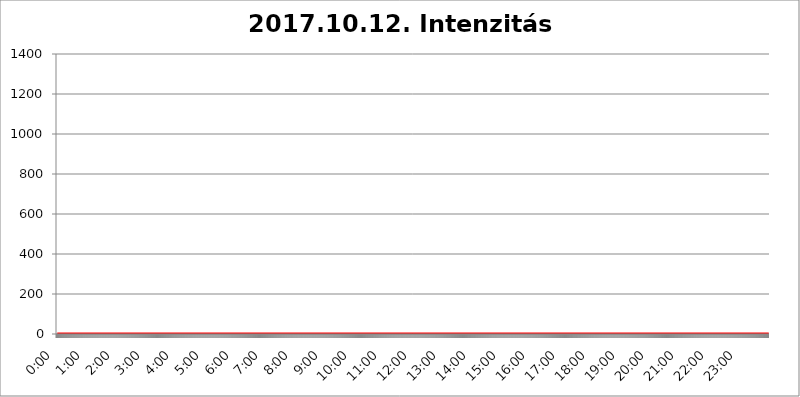
| Category | 2017.10.12. Intenzitás [W/m^2] |
|---|---|
| 0.0 | 0 |
| 0.0006944444444444445 | 0 |
| 0.001388888888888889 | 0 |
| 0.0020833333333333333 | 0 |
| 0.002777777777777778 | 0 |
| 0.003472222222222222 | 0 |
| 0.004166666666666667 | 0 |
| 0.004861111111111111 | 0 |
| 0.005555555555555556 | 0 |
| 0.0062499999999999995 | 0 |
| 0.006944444444444444 | 0 |
| 0.007638888888888889 | 0 |
| 0.008333333333333333 | 0 |
| 0.009027777777777779 | 0 |
| 0.009722222222222222 | 0 |
| 0.010416666666666666 | 0 |
| 0.011111111111111112 | 0 |
| 0.011805555555555555 | 0 |
| 0.012499999999999999 | 0 |
| 0.013194444444444444 | 0 |
| 0.013888888888888888 | 0 |
| 0.014583333333333332 | 0 |
| 0.015277777777777777 | 0 |
| 0.015972222222222224 | 0 |
| 0.016666666666666666 | 0 |
| 0.017361111111111112 | 0 |
| 0.018055555555555557 | 0 |
| 0.01875 | 0 |
| 0.019444444444444445 | 0 |
| 0.02013888888888889 | 0 |
| 0.020833333333333332 | 0 |
| 0.02152777777777778 | 0 |
| 0.022222222222222223 | 0 |
| 0.02291666666666667 | 0 |
| 0.02361111111111111 | 0 |
| 0.024305555555555556 | 0 |
| 0.024999999999999998 | 0 |
| 0.025694444444444447 | 0 |
| 0.02638888888888889 | 0 |
| 0.027083333333333334 | 0 |
| 0.027777777777777776 | 0 |
| 0.02847222222222222 | 0 |
| 0.029166666666666664 | 0 |
| 0.029861111111111113 | 0 |
| 0.030555555555555555 | 0 |
| 0.03125 | 0 |
| 0.03194444444444445 | 0 |
| 0.03263888888888889 | 0 |
| 0.03333333333333333 | 0 |
| 0.034027777777777775 | 0 |
| 0.034722222222222224 | 0 |
| 0.035416666666666666 | 0 |
| 0.036111111111111115 | 0 |
| 0.03680555555555556 | 0 |
| 0.0375 | 0 |
| 0.03819444444444444 | 0 |
| 0.03888888888888889 | 0 |
| 0.03958333333333333 | 0 |
| 0.04027777777777778 | 0 |
| 0.04097222222222222 | 0 |
| 0.041666666666666664 | 0 |
| 0.042361111111111106 | 0 |
| 0.04305555555555556 | 0 |
| 0.043750000000000004 | 0 |
| 0.044444444444444446 | 0 |
| 0.04513888888888889 | 0 |
| 0.04583333333333334 | 0 |
| 0.04652777777777778 | 0 |
| 0.04722222222222222 | 0 |
| 0.04791666666666666 | 0 |
| 0.04861111111111111 | 0 |
| 0.049305555555555554 | 0 |
| 0.049999999999999996 | 0 |
| 0.05069444444444445 | 0 |
| 0.051388888888888894 | 0 |
| 0.052083333333333336 | 0 |
| 0.05277777777777778 | 0 |
| 0.05347222222222222 | 0 |
| 0.05416666666666667 | 0 |
| 0.05486111111111111 | 0 |
| 0.05555555555555555 | 0 |
| 0.05625 | 0 |
| 0.05694444444444444 | 0 |
| 0.057638888888888885 | 0 |
| 0.05833333333333333 | 0 |
| 0.05902777777777778 | 0 |
| 0.059722222222222225 | 0 |
| 0.06041666666666667 | 0 |
| 0.061111111111111116 | 0 |
| 0.06180555555555556 | 0 |
| 0.0625 | 0 |
| 0.06319444444444444 | 0 |
| 0.06388888888888888 | 0 |
| 0.06458333333333334 | 0 |
| 0.06527777777777778 | 0 |
| 0.06597222222222222 | 0 |
| 0.06666666666666667 | 0 |
| 0.06736111111111111 | 0 |
| 0.06805555555555555 | 0 |
| 0.06874999999999999 | 0 |
| 0.06944444444444443 | 0 |
| 0.07013888888888889 | 0 |
| 0.07083333333333333 | 0 |
| 0.07152777777777779 | 0 |
| 0.07222222222222223 | 0 |
| 0.07291666666666667 | 0 |
| 0.07361111111111111 | 0 |
| 0.07430555555555556 | 0 |
| 0.075 | 0 |
| 0.07569444444444444 | 0 |
| 0.0763888888888889 | 0 |
| 0.07708333333333334 | 0 |
| 0.07777777777777778 | 0 |
| 0.07847222222222222 | 0 |
| 0.07916666666666666 | 0 |
| 0.0798611111111111 | 0 |
| 0.08055555555555556 | 0 |
| 0.08125 | 0 |
| 0.08194444444444444 | 0 |
| 0.08263888888888889 | 0 |
| 0.08333333333333333 | 0 |
| 0.08402777777777777 | 0 |
| 0.08472222222222221 | 0 |
| 0.08541666666666665 | 0 |
| 0.08611111111111112 | 0 |
| 0.08680555555555557 | 0 |
| 0.08750000000000001 | 0 |
| 0.08819444444444445 | 0 |
| 0.08888888888888889 | 0 |
| 0.08958333333333333 | 0 |
| 0.09027777777777778 | 0 |
| 0.09097222222222222 | 0 |
| 0.09166666666666667 | 0 |
| 0.09236111111111112 | 0 |
| 0.09305555555555556 | 0 |
| 0.09375 | 0 |
| 0.09444444444444444 | 0 |
| 0.09513888888888888 | 0 |
| 0.09583333333333333 | 0 |
| 0.09652777777777777 | 0 |
| 0.09722222222222222 | 0 |
| 0.09791666666666667 | 0 |
| 0.09861111111111111 | 0 |
| 0.09930555555555555 | 0 |
| 0.09999999999999999 | 0 |
| 0.10069444444444443 | 0 |
| 0.1013888888888889 | 0 |
| 0.10208333333333335 | 0 |
| 0.10277777777777779 | 0 |
| 0.10347222222222223 | 0 |
| 0.10416666666666667 | 0 |
| 0.10486111111111111 | 0 |
| 0.10555555555555556 | 0 |
| 0.10625 | 0 |
| 0.10694444444444444 | 0 |
| 0.1076388888888889 | 0 |
| 0.10833333333333334 | 0 |
| 0.10902777777777778 | 0 |
| 0.10972222222222222 | 0 |
| 0.1111111111111111 | 0 |
| 0.11180555555555556 | 0 |
| 0.11180555555555556 | 0 |
| 0.1125 | 0 |
| 0.11319444444444444 | 0 |
| 0.11388888888888889 | 0 |
| 0.11458333333333333 | 0 |
| 0.11527777777777777 | 0 |
| 0.11597222222222221 | 0 |
| 0.11666666666666665 | 0 |
| 0.1173611111111111 | 0 |
| 0.11805555555555557 | 0 |
| 0.11944444444444445 | 0 |
| 0.12013888888888889 | 0 |
| 0.12083333333333333 | 0 |
| 0.12152777777777778 | 0 |
| 0.12222222222222223 | 0 |
| 0.12291666666666667 | 0 |
| 0.12291666666666667 | 0 |
| 0.12361111111111112 | 0 |
| 0.12430555555555556 | 0 |
| 0.125 | 0 |
| 0.12569444444444444 | 0 |
| 0.12638888888888888 | 0 |
| 0.12708333333333333 | 0 |
| 0.16875 | 0 |
| 0.12847222222222224 | 0 |
| 0.12916666666666668 | 0 |
| 0.12986111111111112 | 0 |
| 0.13055555555555556 | 0 |
| 0.13125 | 0 |
| 0.13194444444444445 | 0 |
| 0.1326388888888889 | 0 |
| 0.13333333333333333 | 0 |
| 0.13402777777777777 | 0 |
| 0.13402777777777777 | 0 |
| 0.13472222222222222 | 0 |
| 0.13541666666666666 | 0 |
| 0.1361111111111111 | 0 |
| 0.13749999999999998 | 0 |
| 0.13819444444444443 | 0 |
| 0.1388888888888889 | 0 |
| 0.13958333333333334 | 0 |
| 0.14027777777777778 | 0 |
| 0.14097222222222222 | 0 |
| 0.14166666666666666 | 0 |
| 0.1423611111111111 | 0 |
| 0.14305555555555557 | 0 |
| 0.14375000000000002 | 0 |
| 0.14444444444444446 | 0 |
| 0.1451388888888889 | 0 |
| 0.1451388888888889 | 0 |
| 0.14652777777777778 | 0 |
| 0.14722222222222223 | 0 |
| 0.14791666666666667 | 0 |
| 0.1486111111111111 | 0 |
| 0.14930555555555555 | 0 |
| 0.15 | 0 |
| 0.15069444444444444 | 0 |
| 0.15138888888888888 | 0 |
| 0.15208333333333332 | 0 |
| 0.15277777777777776 | 0 |
| 0.15347222222222223 | 0 |
| 0.15416666666666667 | 0 |
| 0.15486111111111112 | 0 |
| 0.15555555555555556 | 0 |
| 0.15625 | 0 |
| 0.15694444444444444 | 0 |
| 0.15763888888888888 | 0 |
| 0.15833333333333333 | 0 |
| 0.15902777777777777 | 0 |
| 0.15972222222222224 | 0 |
| 0.16041666666666668 | 0 |
| 0.16111111111111112 | 0 |
| 0.16180555555555556 | 0 |
| 0.1625 | 0 |
| 0.16319444444444445 | 0 |
| 0.1638888888888889 | 0 |
| 0.16458333333333333 | 0 |
| 0.16527777777777777 | 0 |
| 0.16597222222222222 | 0 |
| 0.16666666666666666 | 0 |
| 0.1673611111111111 | 0 |
| 0.16805555555555554 | 0 |
| 0.16874999999999998 | 0 |
| 0.16944444444444443 | 0 |
| 0.17013888888888887 | 0 |
| 0.1708333333333333 | 0 |
| 0.17152777777777775 | 0 |
| 0.17222222222222225 | 0 |
| 0.1729166666666667 | 0 |
| 0.17361111111111113 | 0 |
| 0.17430555555555557 | 0 |
| 0.17500000000000002 | 0 |
| 0.17569444444444446 | 0 |
| 0.1763888888888889 | 0 |
| 0.17708333333333334 | 0 |
| 0.17777777777777778 | 0 |
| 0.17847222222222223 | 0 |
| 0.17916666666666667 | 0 |
| 0.1798611111111111 | 0 |
| 0.18055555555555555 | 0 |
| 0.18125 | 0 |
| 0.18194444444444444 | 0 |
| 0.1826388888888889 | 0 |
| 0.18333333333333335 | 0 |
| 0.1840277777777778 | 0 |
| 0.18472222222222223 | 0 |
| 0.18541666666666667 | 0 |
| 0.18611111111111112 | 0 |
| 0.18680555555555556 | 0 |
| 0.1875 | 0 |
| 0.18819444444444444 | 0 |
| 0.18888888888888888 | 0 |
| 0.18958333333333333 | 0 |
| 0.19027777777777777 | 0 |
| 0.1909722222222222 | 0 |
| 0.19166666666666665 | 0 |
| 0.19236111111111112 | 0 |
| 0.19305555555555554 | 0 |
| 0.19375 | 0 |
| 0.19444444444444445 | 0 |
| 0.1951388888888889 | 0 |
| 0.19583333333333333 | 0 |
| 0.19652777777777777 | 0 |
| 0.19722222222222222 | 0 |
| 0.19791666666666666 | 0 |
| 0.1986111111111111 | 0 |
| 0.19930555555555554 | 0 |
| 0.19999999999999998 | 0 |
| 0.20069444444444443 | 0 |
| 0.20138888888888887 | 0 |
| 0.2020833333333333 | 0 |
| 0.2027777777777778 | 0 |
| 0.2034722222222222 | 0 |
| 0.2041666666666667 | 0 |
| 0.20486111111111113 | 0 |
| 0.20555555555555557 | 0 |
| 0.20625000000000002 | 0 |
| 0.20694444444444446 | 0 |
| 0.2076388888888889 | 0 |
| 0.20833333333333334 | 0 |
| 0.20902777777777778 | 0 |
| 0.20972222222222223 | 0 |
| 0.21041666666666667 | 0 |
| 0.2111111111111111 | 0 |
| 0.21180555555555555 | 0 |
| 0.2125 | 0 |
| 0.21319444444444444 | 0 |
| 0.2138888888888889 | 0 |
| 0.21458333333333335 | 0 |
| 0.2152777777777778 | 0 |
| 0.21597222222222223 | 0 |
| 0.21666666666666667 | 0 |
| 0.21736111111111112 | 0 |
| 0.21805555555555556 | 0 |
| 0.21875 | 0 |
| 0.21944444444444444 | 0 |
| 0.22013888888888888 | 0 |
| 0.22083333333333333 | 0 |
| 0.22152777777777777 | 0 |
| 0.2222222222222222 | 0 |
| 0.22291666666666665 | 0 |
| 0.2236111111111111 | 0 |
| 0.22430555555555556 | 0 |
| 0.225 | 0 |
| 0.22569444444444445 | 0 |
| 0.2263888888888889 | 0 |
| 0.22708333333333333 | 0 |
| 0.22777777777777777 | 0 |
| 0.22847222222222222 | 0 |
| 0.22916666666666666 | 0 |
| 0.2298611111111111 | 0 |
| 0.23055555555555554 | 0 |
| 0.23124999999999998 | 0 |
| 0.23194444444444443 | 0 |
| 0.23263888888888887 | 0 |
| 0.2333333333333333 | 0 |
| 0.2340277777777778 | 0 |
| 0.2347222222222222 | 0 |
| 0.2354166666666667 | 0 |
| 0.23611111111111113 | 0 |
| 0.23680555555555557 | 0 |
| 0.23750000000000002 | 0 |
| 0.23819444444444446 | 0 |
| 0.2388888888888889 | 0 |
| 0.23958333333333334 | 0 |
| 0.24027777777777778 | 0 |
| 0.24097222222222223 | 0 |
| 0.24166666666666667 | 0 |
| 0.2423611111111111 | 0 |
| 0.24305555555555555 | 0 |
| 0.24375 | 0 |
| 0.24444444444444446 | 0 |
| 0.24513888888888888 | 0 |
| 0.24583333333333335 | 0 |
| 0.2465277777777778 | 0 |
| 0.24722222222222223 | 0 |
| 0.24791666666666667 | 0 |
| 0.24861111111111112 | 0 |
| 0.24930555555555556 | 0 |
| 0.25 | 0 |
| 0.25069444444444444 | 0 |
| 0.2513888888888889 | 0 |
| 0.2520833333333333 | 0 |
| 0.25277777777777777 | 0 |
| 0.2534722222222222 | 0 |
| 0.25416666666666665 | 0 |
| 0.2548611111111111 | 0 |
| 0.2555555555555556 | 0 |
| 0.25625000000000003 | 0 |
| 0.2569444444444445 | 0 |
| 0.2576388888888889 | 0 |
| 0.25833333333333336 | 0 |
| 0.2590277777777778 | 0 |
| 0.25972222222222224 | 0 |
| 0.2604166666666667 | 0 |
| 0.2611111111111111 | 0 |
| 0.26180555555555557 | 0 |
| 0.2625 | 0 |
| 0.26319444444444445 | 0 |
| 0.2638888888888889 | 0 |
| 0.26458333333333334 | 0 |
| 0.2652777777777778 | 0 |
| 0.2659722222222222 | 0 |
| 0.26666666666666666 | 0 |
| 0.2673611111111111 | 0 |
| 0.26805555555555555 | 0 |
| 0.26875 | 0 |
| 0.26944444444444443 | 0 |
| 0.2701388888888889 | 0 |
| 0.2708333333333333 | 0 |
| 0.27152777777777776 | 0 |
| 0.2722222222222222 | 0 |
| 0.27291666666666664 | 0 |
| 0.2736111111111111 | 0 |
| 0.2743055555555555 | 0 |
| 0.27499999999999997 | 0 |
| 0.27569444444444446 | 0 |
| 0.27638888888888885 | 0 |
| 0.27708333333333335 | 0 |
| 0.2777777777777778 | 0 |
| 0.27847222222222223 | 0 |
| 0.2791666666666667 | 0 |
| 0.2798611111111111 | 0 |
| 0.28055555555555556 | 0 |
| 0.28125 | 0 |
| 0.28194444444444444 | 0 |
| 0.2826388888888889 | 0 |
| 0.2833333333333333 | 0 |
| 0.28402777777777777 | 0 |
| 0.2847222222222222 | 0 |
| 0.28541666666666665 | 0 |
| 0.28611111111111115 | 0 |
| 0.28680555555555554 | 0 |
| 0.28750000000000003 | 0 |
| 0.2881944444444445 | 0 |
| 0.2888888888888889 | 0 |
| 0.28958333333333336 | 0 |
| 0.2902777777777778 | 0 |
| 0.29097222222222224 | 0 |
| 0.2916666666666667 | 0 |
| 0.2923611111111111 | 0 |
| 0.29305555555555557 | 0 |
| 0.29375 | 0 |
| 0.29444444444444445 | 0 |
| 0.2951388888888889 | 0 |
| 0.29583333333333334 | 0 |
| 0.2965277777777778 | 0 |
| 0.2972222222222222 | 0 |
| 0.29791666666666666 | 0 |
| 0.2986111111111111 | 0 |
| 0.29930555555555555 | 0 |
| 0.3 | 0 |
| 0.30069444444444443 | 0 |
| 0.3013888888888889 | 0 |
| 0.3020833333333333 | 0 |
| 0.30277777777777776 | 0 |
| 0.3034722222222222 | 0 |
| 0.30416666666666664 | 0 |
| 0.3048611111111111 | 0 |
| 0.3055555555555555 | 0 |
| 0.30624999999999997 | 0 |
| 0.3069444444444444 | 0 |
| 0.3076388888888889 | 0 |
| 0.30833333333333335 | 0 |
| 0.3090277777777778 | 0 |
| 0.30972222222222223 | 0 |
| 0.3104166666666667 | 0 |
| 0.3111111111111111 | 0 |
| 0.31180555555555556 | 0 |
| 0.3125 | 0 |
| 0.31319444444444444 | 0 |
| 0.3138888888888889 | 0 |
| 0.3145833333333333 | 0 |
| 0.31527777777777777 | 0 |
| 0.3159722222222222 | 0 |
| 0.31666666666666665 | 0 |
| 0.31736111111111115 | 0 |
| 0.31805555555555554 | 0 |
| 0.31875000000000003 | 0 |
| 0.3194444444444445 | 0 |
| 0.3201388888888889 | 0 |
| 0.32083333333333336 | 0 |
| 0.3215277777777778 | 0 |
| 0.32222222222222224 | 0 |
| 0.3229166666666667 | 0 |
| 0.3236111111111111 | 0 |
| 0.32430555555555557 | 0 |
| 0.325 | 0 |
| 0.32569444444444445 | 0 |
| 0.3263888888888889 | 0 |
| 0.32708333333333334 | 0 |
| 0.3277777777777778 | 0 |
| 0.3284722222222222 | 0 |
| 0.32916666666666666 | 0 |
| 0.3298611111111111 | 0 |
| 0.33055555555555555 | 0 |
| 0.33125 | 0 |
| 0.33194444444444443 | 0 |
| 0.3326388888888889 | 0 |
| 0.3333333333333333 | 0 |
| 0.3340277777777778 | 0 |
| 0.3347222222222222 | 0 |
| 0.3354166666666667 | 0 |
| 0.3361111111111111 | 0 |
| 0.3368055555555556 | 0 |
| 0.33749999999999997 | 0 |
| 0.33819444444444446 | 0 |
| 0.33888888888888885 | 0 |
| 0.33958333333333335 | 0 |
| 0.34027777777777773 | 0 |
| 0.34097222222222223 | 0 |
| 0.3416666666666666 | 0 |
| 0.3423611111111111 | 0 |
| 0.3430555555555555 | 0 |
| 0.34375 | 0 |
| 0.3444444444444445 | 0 |
| 0.3451388888888889 | 0 |
| 0.3458333333333334 | 0 |
| 0.34652777777777777 | 0 |
| 0.34722222222222227 | 0 |
| 0.34791666666666665 | 0 |
| 0.34861111111111115 | 0 |
| 0.34930555555555554 | 0 |
| 0.35000000000000003 | 0 |
| 0.3506944444444444 | 0 |
| 0.3513888888888889 | 0 |
| 0.3520833333333333 | 0 |
| 0.3527777777777778 | 0 |
| 0.3534722222222222 | 0 |
| 0.3541666666666667 | 0 |
| 0.3548611111111111 | 0 |
| 0.35555555555555557 | 0 |
| 0.35625 | 0 |
| 0.35694444444444445 | 0 |
| 0.3576388888888889 | 0 |
| 0.35833333333333334 | 0 |
| 0.3590277777777778 | 0 |
| 0.3597222222222222 | 0 |
| 0.36041666666666666 | 0 |
| 0.3611111111111111 | 0 |
| 0.36180555555555555 | 0 |
| 0.3625 | 0 |
| 0.36319444444444443 | 0 |
| 0.3638888888888889 | 0 |
| 0.3645833333333333 | 0 |
| 0.3652777777777778 | 0 |
| 0.3659722222222222 | 0 |
| 0.3666666666666667 | 0 |
| 0.3673611111111111 | 0 |
| 0.3680555555555556 | 0 |
| 0.36874999999999997 | 0 |
| 0.36944444444444446 | 0 |
| 0.37013888888888885 | 0 |
| 0.37083333333333335 | 0 |
| 0.37152777777777773 | 0 |
| 0.37222222222222223 | 0 |
| 0.3729166666666666 | 0 |
| 0.3736111111111111 | 0 |
| 0.3743055555555555 | 0 |
| 0.375 | 0 |
| 0.3756944444444445 | 0 |
| 0.3763888888888889 | 0 |
| 0.3770833333333334 | 0 |
| 0.37777777777777777 | 0 |
| 0.37847222222222227 | 0 |
| 0.37916666666666665 | 0 |
| 0.37986111111111115 | 0 |
| 0.38055555555555554 | 0 |
| 0.38125000000000003 | 0 |
| 0.3819444444444444 | 0 |
| 0.3826388888888889 | 0 |
| 0.3833333333333333 | 0 |
| 0.3840277777777778 | 0 |
| 0.3847222222222222 | 0 |
| 0.3854166666666667 | 0 |
| 0.3861111111111111 | 0 |
| 0.38680555555555557 | 0 |
| 0.3875 | 0 |
| 0.38819444444444445 | 0 |
| 0.3888888888888889 | 0 |
| 0.38958333333333334 | 0 |
| 0.3902777777777778 | 0 |
| 0.3909722222222222 | 0 |
| 0.39166666666666666 | 0 |
| 0.3923611111111111 | 0 |
| 0.39305555555555555 | 0 |
| 0.39375 | 0 |
| 0.39444444444444443 | 0 |
| 0.3951388888888889 | 0 |
| 0.3958333333333333 | 0 |
| 0.3965277777777778 | 0 |
| 0.3972222222222222 | 0 |
| 0.3979166666666667 | 0 |
| 0.3986111111111111 | 0 |
| 0.3993055555555556 | 0 |
| 0.39999999999999997 | 0 |
| 0.40069444444444446 | 0 |
| 0.40138888888888885 | 0 |
| 0.40208333333333335 | 0 |
| 0.40277777777777773 | 0 |
| 0.40347222222222223 | 0 |
| 0.4041666666666666 | 0 |
| 0.4048611111111111 | 0 |
| 0.4055555555555555 | 0 |
| 0.40625 | 0 |
| 0.4069444444444445 | 0 |
| 0.4076388888888889 | 0 |
| 0.4083333333333334 | 0 |
| 0.40902777777777777 | 0 |
| 0.40972222222222227 | 0 |
| 0.41041666666666665 | 0 |
| 0.41111111111111115 | 0 |
| 0.41180555555555554 | 0 |
| 0.41250000000000003 | 0 |
| 0.4131944444444444 | 0 |
| 0.4138888888888889 | 0 |
| 0.4145833333333333 | 0 |
| 0.4152777777777778 | 0 |
| 0.4159722222222222 | 0 |
| 0.4166666666666667 | 0 |
| 0.4173611111111111 | 0 |
| 0.41805555555555557 | 0 |
| 0.41875 | 0 |
| 0.41944444444444445 | 0 |
| 0.4201388888888889 | 0 |
| 0.42083333333333334 | 0 |
| 0.4215277777777778 | 0 |
| 0.4222222222222222 | 0 |
| 0.42291666666666666 | 0 |
| 0.4236111111111111 | 0 |
| 0.42430555555555555 | 0 |
| 0.425 | 0 |
| 0.42569444444444443 | 0 |
| 0.4263888888888889 | 0 |
| 0.4270833333333333 | 0 |
| 0.4277777777777778 | 0 |
| 0.4284722222222222 | 0 |
| 0.4291666666666667 | 0 |
| 0.4298611111111111 | 0 |
| 0.4305555555555556 | 0 |
| 0.43124999999999997 | 0 |
| 0.43194444444444446 | 0 |
| 0.43263888888888885 | 0 |
| 0.43333333333333335 | 0 |
| 0.43402777777777773 | 0 |
| 0.43472222222222223 | 0 |
| 0.4354166666666666 | 0 |
| 0.4361111111111111 | 0 |
| 0.4368055555555555 | 0 |
| 0.4375 | 0 |
| 0.4381944444444445 | 0 |
| 0.4388888888888889 | 0 |
| 0.4395833333333334 | 0 |
| 0.44027777777777777 | 0 |
| 0.44097222222222227 | 0 |
| 0.44166666666666665 | 0 |
| 0.44236111111111115 | 0 |
| 0.44305555555555554 | 0 |
| 0.44375000000000003 | 0 |
| 0.4444444444444444 | 0 |
| 0.4451388888888889 | 0 |
| 0.4458333333333333 | 0 |
| 0.4465277777777778 | 0 |
| 0.4472222222222222 | 0 |
| 0.4479166666666667 | 0 |
| 0.4486111111111111 | 0 |
| 0.44930555555555557 | 0 |
| 0.45 | 0 |
| 0.45069444444444445 | 0 |
| 0.4513888888888889 | 0 |
| 0.45208333333333334 | 0 |
| 0.4527777777777778 | 0 |
| 0.4534722222222222 | 0 |
| 0.45416666666666666 | 0 |
| 0.4548611111111111 | 0 |
| 0.45555555555555555 | 0 |
| 0.45625 | 0 |
| 0.45694444444444443 | 0 |
| 0.4576388888888889 | 0 |
| 0.4583333333333333 | 0 |
| 0.4590277777777778 | 0 |
| 0.4597222222222222 | 0 |
| 0.4604166666666667 | 0 |
| 0.4611111111111111 | 0 |
| 0.4618055555555556 | 0 |
| 0.46249999999999997 | 0 |
| 0.46319444444444446 | 0 |
| 0.46388888888888885 | 0 |
| 0.46458333333333335 | 0 |
| 0.46527777777777773 | 0 |
| 0.46597222222222223 | 0 |
| 0.4666666666666666 | 0 |
| 0.4673611111111111 | 0 |
| 0.4680555555555555 | 0 |
| 0.46875 | 0 |
| 0.4694444444444445 | 0 |
| 0.4701388888888889 | 0 |
| 0.4708333333333334 | 0 |
| 0.47152777777777777 | 0 |
| 0.47222222222222227 | 0 |
| 0.47291666666666665 | 0 |
| 0.47361111111111115 | 0 |
| 0.47430555555555554 | 0 |
| 0.47500000000000003 | 0 |
| 0.4756944444444444 | 0 |
| 0.4763888888888889 | 0 |
| 0.4770833333333333 | 0 |
| 0.4777777777777778 | 0 |
| 0.4784722222222222 | 0 |
| 0.4791666666666667 | 0 |
| 0.4798611111111111 | 0 |
| 0.48055555555555557 | 0 |
| 0.48125 | 0 |
| 0.48194444444444445 | 0 |
| 0.4826388888888889 | 0 |
| 0.48333333333333334 | 0 |
| 0.4840277777777778 | 0 |
| 0.4847222222222222 | 0 |
| 0.48541666666666666 | 0 |
| 0.4861111111111111 | 0 |
| 0.48680555555555555 | 0 |
| 0.4875 | 0 |
| 0.48819444444444443 | 0 |
| 0.4888888888888889 | 0 |
| 0.4895833333333333 | 0 |
| 0.4902777777777778 | 0 |
| 0.4909722222222222 | 0 |
| 0.4916666666666667 | 0 |
| 0.4923611111111111 | 0 |
| 0.4930555555555556 | 0 |
| 0.49374999999999997 | 0 |
| 0.49444444444444446 | 0 |
| 0.49513888888888885 | 0 |
| 0.49583333333333335 | 0 |
| 0.49652777777777773 | 0 |
| 0.49722222222222223 | 0 |
| 0.4979166666666666 | 0 |
| 0.4986111111111111 | 0 |
| 0.4993055555555555 | 0 |
| 0.5 | 0 |
| 0.5006944444444444 | 0 |
| 0.5013888888888889 | 0 |
| 0.5020833333333333 | 0 |
| 0.5027777777777778 | 0 |
| 0.5034722222222222 | 0 |
| 0.5041666666666667 | 0 |
| 0.5048611111111111 | 0 |
| 0.5055555555555555 | 0 |
| 0.50625 | 0 |
| 0.5069444444444444 | 0 |
| 0.5076388888888889 | 0 |
| 0.5083333333333333 | 0 |
| 0.5090277777777777 | 0 |
| 0.5097222222222222 | 0 |
| 0.5104166666666666 | 0 |
| 0.5111111111111112 | 0 |
| 0.5118055555555555 | 0 |
| 0.5125000000000001 | 0 |
| 0.5131944444444444 | 0 |
| 0.513888888888889 | 0 |
| 0.5145833333333333 | 0 |
| 0.5152777777777778 | 0 |
| 0.5159722222222222 | 0 |
| 0.5166666666666667 | 0 |
| 0.517361111111111 | 0 |
| 0.5180555555555556 | 0 |
| 0.5187499999999999 | 0 |
| 0.5194444444444445 | 0 |
| 0.5201388888888888 | 0 |
| 0.5208333333333334 | 0 |
| 0.5215277777777778 | 0 |
| 0.5222222222222223 | 0 |
| 0.5229166666666667 | 0 |
| 0.5236111111111111 | 0 |
| 0.5243055555555556 | 0 |
| 0.525 | 0 |
| 0.5256944444444445 | 0 |
| 0.5263888888888889 | 0 |
| 0.5270833333333333 | 0 |
| 0.5277777777777778 | 0 |
| 0.5284722222222222 | 0 |
| 0.5291666666666667 | 0 |
| 0.5298611111111111 | 0 |
| 0.5305555555555556 | 0 |
| 0.53125 | 0 |
| 0.5319444444444444 | 0 |
| 0.5326388888888889 | 0 |
| 0.5333333333333333 | 0 |
| 0.5340277777777778 | 0 |
| 0.5347222222222222 | 0 |
| 0.5354166666666667 | 0 |
| 0.5361111111111111 | 0 |
| 0.5368055555555555 | 0 |
| 0.5375 | 0 |
| 0.5381944444444444 | 0 |
| 0.5388888888888889 | 0 |
| 0.5395833333333333 | 0 |
| 0.5402777777777777 | 0 |
| 0.5409722222222222 | 0 |
| 0.5416666666666666 | 0 |
| 0.5423611111111112 | 0 |
| 0.5430555555555555 | 0 |
| 0.5437500000000001 | 0 |
| 0.5444444444444444 | 0 |
| 0.545138888888889 | 0 |
| 0.5458333333333333 | 0 |
| 0.5465277777777778 | 0 |
| 0.5472222222222222 | 0 |
| 0.5479166666666667 | 0 |
| 0.548611111111111 | 0 |
| 0.5493055555555556 | 0 |
| 0.5499999999999999 | 0 |
| 0.5506944444444445 | 0 |
| 0.5513888888888888 | 0 |
| 0.5520833333333334 | 0 |
| 0.5527777777777778 | 0 |
| 0.5534722222222223 | 0 |
| 0.5541666666666667 | 0 |
| 0.5548611111111111 | 0 |
| 0.5555555555555556 | 0 |
| 0.55625 | 0 |
| 0.5569444444444445 | 0 |
| 0.5576388888888889 | 0 |
| 0.5583333333333333 | 0 |
| 0.5590277777777778 | 0 |
| 0.5597222222222222 | 0 |
| 0.5604166666666667 | 0 |
| 0.5611111111111111 | 0 |
| 0.5618055555555556 | 0 |
| 0.5625 | 0 |
| 0.5631944444444444 | 0 |
| 0.5638888888888889 | 0 |
| 0.5645833333333333 | 0 |
| 0.5652777777777778 | 0 |
| 0.5659722222222222 | 0 |
| 0.5666666666666667 | 0 |
| 0.5673611111111111 | 0 |
| 0.5680555555555555 | 0 |
| 0.56875 | 0 |
| 0.5694444444444444 | 0 |
| 0.5701388888888889 | 0 |
| 0.5708333333333333 | 0 |
| 0.5715277777777777 | 0 |
| 0.5722222222222222 | 0 |
| 0.5729166666666666 | 0 |
| 0.5736111111111112 | 0 |
| 0.5743055555555555 | 0 |
| 0.5750000000000001 | 0 |
| 0.5756944444444444 | 0 |
| 0.576388888888889 | 0 |
| 0.5770833333333333 | 0 |
| 0.5777777777777778 | 0 |
| 0.5784722222222222 | 0 |
| 0.5791666666666667 | 0 |
| 0.579861111111111 | 0 |
| 0.5805555555555556 | 0 |
| 0.5812499999999999 | 0 |
| 0.5819444444444445 | 0 |
| 0.5826388888888888 | 0 |
| 0.5833333333333334 | 0 |
| 0.5840277777777778 | 0 |
| 0.5847222222222223 | 0 |
| 0.5854166666666667 | 0 |
| 0.5861111111111111 | 0 |
| 0.5868055555555556 | 0 |
| 0.5875 | 0 |
| 0.5881944444444445 | 0 |
| 0.5888888888888889 | 0 |
| 0.5895833333333333 | 0 |
| 0.5902777777777778 | 0 |
| 0.5909722222222222 | 0 |
| 0.5916666666666667 | 0 |
| 0.5923611111111111 | 0 |
| 0.5930555555555556 | 0 |
| 0.59375 | 0 |
| 0.5944444444444444 | 0 |
| 0.5951388888888889 | 0 |
| 0.5958333333333333 | 0 |
| 0.5965277777777778 | 0 |
| 0.5972222222222222 | 0 |
| 0.5979166666666667 | 0 |
| 0.5986111111111111 | 0 |
| 0.5993055555555555 | 0 |
| 0.6 | 0 |
| 0.6006944444444444 | 0 |
| 0.6013888888888889 | 0 |
| 0.6020833333333333 | 0 |
| 0.6027777777777777 | 0 |
| 0.6034722222222222 | 0 |
| 0.6041666666666666 | 0 |
| 0.6048611111111112 | 0 |
| 0.6055555555555555 | 0 |
| 0.6062500000000001 | 0 |
| 0.6069444444444444 | 0 |
| 0.607638888888889 | 0 |
| 0.6083333333333333 | 0 |
| 0.6090277777777778 | 0 |
| 0.6097222222222222 | 0 |
| 0.6104166666666667 | 0 |
| 0.611111111111111 | 0 |
| 0.6118055555555556 | 0 |
| 0.6124999999999999 | 0 |
| 0.6131944444444445 | 0 |
| 0.6138888888888888 | 0 |
| 0.6145833333333334 | 0 |
| 0.6152777777777778 | 0 |
| 0.6159722222222223 | 0 |
| 0.6166666666666667 | 0 |
| 0.6173611111111111 | 0 |
| 0.6180555555555556 | 0 |
| 0.61875 | 0 |
| 0.6194444444444445 | 0 |
| 0.6201388888888889 | 0 |
| 0.6208333333333333 | 0 |
| 0.6215277777777778 | 0 |
| 0.6222222222222222 | 0 |
| 0.6229166666666667 | 0 |
| 0.6236111111111111 | 0 |
| 0.6243055555555556 | 0 |
| 0.625 | 0 |
| 0.6256944444444444 | 0 |
| 0.6263888888888889 | 0 |
| 0.6270833333333333 | 0 |
| 0.6277777777777778 | 0 |
| 0.6284722222222222 | 0 |
| 0.6291666666666667 | 0 |
| 0.6298611111111111 | 0 |
| 0.6305555555555555 | 0 |
| 0.63125 | 0 |
| 0.6319444444444444 | 0 |
| 0.6326388888888889 | 0 |
| 0.6333333333333333 | 0 |
| 0.6340277777777777 | 0 |
| 0.6347222222222222 | 0 |
| 0.6354166666666666 | 0 |
| 0.6361111111111112 | 0 |
| 0.6368055555555555 | 0 |
| 0.6375000000000001 | 0 |
| 0.6381944444444444 | 0 |
| 0.638888888888889 | 0 |
| 0.6395833333333333 | 0 |
| 0.6402777777777778 | 0 |
| 0.6409722222222222 | 0 |
| 0.6416666666666667 | 0 |
| 0.642361111111111 | 0 |
| 0.6430555555555556 | 0 |
| 0.6437499999999999 | 0 |
| 0.6444444444444445 | 0 |
| 0.6451388888888888 | 0 |
| 0.6458333333333334 | 0 |
| 0.6465277777777778 | 0 |
| 0.6472222222222223 | 0 |
| 0.6479166666666667 | 0 |
| 0.6486111111111111 | 0 |
| 0.6493055555555556 | 0 |
| 0.65 | 0 |
| 0.6506944444444445 | 0 |
| 0.6513888888888889 | 0 |
| 0.6520833333333333 | 0 |
| 0.6527777777777778 | 0 |
| 0.6534722222222222 | 0 |
| 0.6541666666666667 | 0 |
| 0.6548611111111111 | 0 |
| 0.6555555555555556 | 0 |
| 0.65625 | 0 |
| 0.6569444444444444 | 0 |
| 0.6576388888888889 | 0 |
| 0.6583333333333333 | 0 |
| 0.6590277777777778 | 0 |
| 0.6597222222222222 | 0 |
| 0.6604166666666667 | 0 |
| 0.6611111111111111 | 0 |
| 0.6618055555555555 | 0 |
| 0.6625 | 0 |
| 0.6631944444444444 | 0 |
| 0.6638888888888889 | 0 |
| 0.6645833333333333 | 0 |
| 0.6652777777777777 | 0 |
| 0.6659722222222222 | 0 |
| 0.6666666666666666 | 0 |
| 0.6673611111111111 | 0 |
| 0.6680555555555556 | 0 |
| 0.6687500000000001 | 0 |
| 0.6694444444444444 | 0 |
| 0.6701388888888888 | 0 |
| 0.6708333333333334 | 0 |
| 0.6715277777777778 | 0 |
| 0.6722222222222222 | 0 |
| 0.6729166666666666 | 0 |
| 0.6736111111111112 | 0 |
| 0.6743055555555556 | 0 |
| 0.6749999999999999 | 0 |
| 0.6756944444444444 | 0 |
| 0.6763888888888889 | 0 |
| 0.6770833333333334 | 0 |
| 0.6777777777777777 | 0 |
| 0.6784722222222223 | 0 |
| 0.6791666666666667 | 0 |
| 0.6798611111111111 | 0 |
| 0.6805555555555555 | 0 |
| 0.68125 | 0 |
| 0.6819444444444445 | 0 |
| 0.6826388888888889 | 0 |
| 0.6833333333333332 | 0 |
| 0.6840277777777778 | 0 |
| 0.6847222222222222 | 0 |
| 0.6854166666666667 | 0 |
| 0.686111111111111 | 0 |
| 0.6868055555555556 | 0 |
| 0.6875 | 0 |
| 0.6881944444444444 | 0 |
| 0.688888888888889 | 0 |
| 0.6895833333333333 | 0 |
| 0.6902777777777778 | 0 |
| 0.6909722222222222 | 0 |
| 0.6916666666666668 | 0 |
| 0.6923611111111111 | 0 |
| 0.6930555555555555 | 0 |
| 0.69375 | 0 |
| 0.6944444444444445 | 0 |
| 0.6951388888888889 | 0 |
| 0.6958333333333333 | 0 |
| 0.6965277777777777 | 0 |
| 0.6972222222222223 | 0 |
| 0.6979166666666666 | 0 |
| 0.6986111111111111 | 0 |
| 0.6993055555555556 | 0 |
| 0.7000000000000001 | 0 |
| 0.7006944444444444 | 0 |
| 0.7013888888888888 | 0 |
| 0.7020833333333334 | 0 |
| 0.7027777777777778 | 0 |
| 0.7034722222222222 | 0 |
| 0.7041666666666666 | 0 |
| 0.7048611111111112 | 0 |
| 0.7055555555555556 | 0 |
| 0.7062499999999999 | 0 |
| 0.7069444444444444 | 0 |
| 0.7076388888888889 | 0 |
| 0.7083333333333334 | 0 |
| 0.7090277777777777 | 0 |
| 0.7097222222222223 | 0 |
| 0.7104166666666667 | 0 |
| 0.7111111111111111 | 0 |
| 0.7118055555555555 | 0 |
| 0.7125 | 0 |
| 0.7131944444444445 | 0 |
| 0.7138888888888889 | 0 |
| 0.7145833333333332 | 0 |
| 0.7152777777777778 | 0 |
| 0.7159722222222222 | 0 |
| 0.7166666666666667 | 0 |
| 0.717361111111111 | 0 |
| 0.7180555555555556 | 0 |
| 0.71875 | 0 |
| 0.7194444444444444 | 0 |
| 0.720138888888889 | 0 |
| 0.7208333333333333 | 0 |
| 0.7215277777777778 | 0 |
| 0.7222222222222222 | 0 |
| 0.7229166666666668 | 0 |
| 0.7236111111111111 | 0 |
| 0.7243055555555555 | 0 |
| 0.725 | 0 |
| 0.7256944444444445 | 0 |
| 0.7263888888888889 | 0 |
| 0.7270833333333333 | 0 |
| 0.7277777777777777 | 0 |
| 0.7284722222222223 | 0 |
| 0.7291666666666666 | 0 |
| 0.7298611111111111 | 0 |
| 0.7305555555555556 | 0 |
| 0.7312500000000001 | 0 |
| 0.7319444444444444 | 0 |
| 0.7326388888888888 | 0 |
| 0.7333333333333334 | 0 |
| 0.7340277777777778 | 0 |
| 0.7347222222222222 | 0 |
| 0.7354166666666666 | 0 |
| 0.7361111111111112 | 0 |
| 0.7368055555555556 | 0 |
| 0.7374999999999999 | 0 |
| 0.7381944444444444 | 0 |
| 0.7388888888888889 | 0 |
| 0.7395833333333334 | 0 |
| 0.7402777777777777 | 0 |
| 0.7409722222222223 | 0 |
| 0.7416666666666667 | 0 |
| 0.7423611111111111 | 0 |
| 0.7430555555555555 | 0 |
| 0.74375 | 0 |
| 0.7444444444444445 | 0 |
| 0.7451388888888889 | 0 |
| 0.7458333333333332 | 0 |
| 0.7465277777777778 | 0 |
| 0.7472222222222222 | 0 |
| 0.7479166666666667 | 0 |
| 0.748611111111111 | 0 |
| 0.7493055555555556 | 0 |
| 0.75 | 0 |
| 0.7506944444444444 | 0 |
| 0.751388888888889 | 0 |
| 0.7520833333333333 | 0 |
| 0.7527777777777778 | 0 |
| 0.7534722222222222 | 0 |
| 0.7541666666666668 | 0 |
| 0.7548611111111111 | 0 |
| 0.7555555555555555 | 0 |
| 0.75625 | 0 |
| 0.7569444444444445 | 0 |
| 0.7576388888888889 | 0 |
| 0.7583333333333333 | 0 |
| 0.7590277777777777 | 0 |
| 0.7597222222222223 | 0 |
| 0.7604166666666666 | 0 |
| 0.7611111111111111 | 0 |
| 0.7618055555555556 | 0 |
| 0.7625000000000001 | 0 |
| 0.7631944444444444 | 0 |
| 0.7638888888888888 | 0 |
| 0.7645833333333334 | 0 |
| 0.7652777777777778 | 0 |
| 0.7659722222222222 | 0 |
| 0.7666666666666666 | 0 |
| 0.7673611111111112 | 0 |
| 0.7680555555555556 | 0 |
| 0.7687499999999999 | 0 |
| 0.7694444444444444 | 0 |
| 0.7701388888888889 | 0 |
| 0.7708333333333334 | 0 |
| 0.7715277777777777 | 0 |
| 0.7722222222222223 | 0 |
| 0.7729166666666667 | 0 |
| 0.7736111111111111 | 0 |
| 0.7743055555555555 | 0 |
| 0.775 | 0 |
| 0.7756944444444445 | 0 |
| 0.7763888888888889 | 0 |
| 0.7770833333333332 | 0 |
| 0.7777777777777778 | 0 |
| 0.7784722222222222 | 0 |
| 0.7791666666666667 | 0 |
| 0.779861111111111 | 0 |
| 0.7805555555555556 | 0 |
| 0.78125 | 0 |
| 0.7819444444444444 | 0 |
| 0.782638888888889 | 0 |
| 0.7833333333333333 | 0 |
| 0.7840277777777778 | 0 |
| 0.7847222222222222 | 0 |
| 0.7854166666666668 | 0 |
| 0.7861111111111111 | 0 |
| 0.7868055555555555 | 0 |
| 0.7875 | 0 |
| 0.7881944444444445 | 0 |
| 0.7888888888888889 | 0 |
| 0.7895833333333333 | 0 |
| 0.7902777777777777 | 0 |
| 0.7909722222222223 | 0 |
| 0.7916666666666666 | 0 |
| 0.7923611111111111 | 0 |
| 0.7930555555555556 | 0 |
| 0.7937500000000001 | 0 |
| 0.7944444444444444 | 0 |
| 0.7951388888888888 | 0 |
| 0.7958333333333334 | 0 |
| 0.7965277777777778 | 0 |
| 0.7972222222222222 | 0 |
| 0.7979166666666666 | 0 |
| 0.7986111111111112 | 0 |
| 0.7993055555555556 | 0 |
| 0.7999999999999999 | 0 |
| 0.8006944444444444 | 0 |
| 0.8013888888888889 | 0 |
| 0.8020833333333334 | 0 |
| 0.8027777777777777 | 0 |
| 0.8034722222222223 | 0 |
| 0.8041666666666667 | 0 |
| 0.8048611111111111 | 0 |
| 0.8055555555555555 | 0 |
| 0.80625 | 0 |
| 0.8069444444444445 | 0 |
| 0.8076388888888889 | 0 |
| 0.8083333333333332 | 0 |
| 0.8090277777777778 | 0 |
| 0.8097222222222222 | 0 |
| 0.8104166666666667 | 0 |
| 0.811111111111111 | 0 |
| 0.8118055555555556 | 0 |
| 0.8125 | 0 |
| 0.8131944444444444 | 0 |
| 0.813888888888889 | 0 |
| 0.8145833333333333 | 0 |
| 0.8152777777777778 | 0 |
| 0.8159722222222222 | 0 |
| 0.8166666666666668 | 0 |
| 0.8173611111111111 | 0 |
| 0.8180555555555555 | 0 |
| 0.81875 | 0 |
| 0.8194444444444445 | 0 |
| 0.8201388888888889 | 0 |
| 0.8208333333333333 | 0 |
| 0.8215277777777777 | 0 |
| 0.8222222222222223 | 0 |
| 0.8229166666666666 | 0 |
| 0.8236111111111111 | 0 |
| 0.8243055555555556 | 0 |
| 0.8250000000000001 | 0 |
| 0.8256944444444444 | 0 |
| 0.8263888888888888 | 0 |
| 0.8270833333333334 | 0 |
| 0.8277777777777778 | 0 |
| 0.8284722222222222 | 0 |
| 0.8291666666666666 | 0 |
| 0.8298611111111112 | 0 |
| 0.8305555555555556 | 0 |
| 0.8312499999999999 | 0 |
| 0.8319444444444444 | 0 |
| 0.8326388888888889 | 0 |
| 0.8333333333333334 | 0 |
| 0.8340277777777777 | 0 |
| 0.8347222222222223 | 0 |
| 0.8354166666666667 | 0 |
| 0.8361111111111111 | 0 |
| 0.8368055555555555 | 0 |
| 0.8375 | 0 |
| 0.8381944444444445 | 0 |
| 0.8388888888888889 | 0 |
| 0.8395833333333332 | 0 |
| 0.8402777777777778 | 0 |
| 0.8409722222222222 | 0 |
| 0.8416666666666667 | 0 |
| 0.842361111111111 | 0 |
| 0.8430555555555556 | 0 |
| 0.84375 | 0 |
| 0.8444444444444444 | 0 |
| 0.845138888888889 | 0 |
| 0.8458333333333333 | 0 |
| 0.8465277777777778 | 0 |
| 0.8472222222222222 | 0 |
| 0.8479166666666668 | 0 |
| 0.8486111111111111 | 0 |
| 0.8493055555555555 | 0 |
| 0.85 | 0 |
| 0.8506944444444445 | 0 |
| 0.8513888888888889 | 0 |
| 0.8520833333333333 | 0 |
| 0.8527777777777777 | 0 |
| 0.8534722222222223 | 0 |
| 0.8541666666666666 | 0 |
| 0.8548611111111111 | 0 |
| 0.8555555555555556 | 0 |
| 0.8562500000000001 | 0 |
| 0.8569444444444444 | 0 |
| 0.8576388888888888 | 0 |
| 0.8583333333333334 | 0 |
| 0.8590277777777778 | 0 |
| 0.8597222222222222 | 0 |
| 0.8604166666666666 | 0 |
| 0.8611111111111112 | 0 |
| 0.8618055555555556 | 0 |
| 0.8624999999999999 | 0 |
| 0.8631944444444444 | 0 |
| 0.8638888888888889 | 0 |
| 0.8645833333333334 | 0 |
| 0.8652777777777777 | 0 |
| 0.8659722222222223 | 0 |
| 0.8666666666666667 | 0 |
| 0.8673611111111111 | 0 |
| 0.8680555555555555 | 0 |
| 0.86875 | 0 |
| 0.8694444444444445 | 0 |
| 0.8701388888888889 | 0 |
| 0.8708333333333332 | 0 |
| 0.8715277777777778 | 0 |
| 0.8722222222222222 | 0 |
| 0.8729166666666667 | 0 |
| 0.873611111111111 | 0 |
| 0.8743055555555556 | 0 |
| 0.875 | 0 |
| 0.8756944444444444 | 0 |
| 0.876388888888889 | 0 |
| 0.8770833333333333 | 0 |
| 0.8777777777777778 | 0 |
| 0.8784722222222222 | 0 |
| 0.8791666666666668 | 0 |
| 0.8798611111111111 | 0 |
| 0.8805555555555555 | 0 |
| 0.88125 | 0 |
| 0.8819444444444445 | 0 |
| 0.8826388888888889 | 0 |
| 0.8833333333333333 | 0 |
| 0.8840277777777777 | 0 |
| 0.8847222222222223 | 0 |
| 0.8854166666666666 | 0 |
| 0.8861111111111111 | 0 |
| 0.8868055555555556 | 0 |
| 0.8875000000000001 | 0 |
| 0.8881944444444444 | 0 |
| 0.8888888888888888 | 0 |
| 0.8895833333333334 | 0 |
| 0.8902777777777778 | 0 |
| 0.8909722222222222 | 0 |
| 0.8916666666666666 | 0 |
| 0.8923611111111112 | 0 |
| 0.8930555555555556 | 0 |
| 0.8937499999999999 | 0 |
| 0.8944444444444444 | 0 |
| 0.8951388888888889 | 0 |
| 0.8958333333333334 | 0 |
| 0.8965277777777777 | 0 |
| 0.8972222222222223 | 0 |
| 0.8979166666666667 | 0 |
| 0.8986111111111111 | 0 |
| 0.8993055555555555 | 0 |
| 0.9 | 0 |
| 0.9006944444444445 | 0 |
| 0.9013888888888889 | 0 |
| 0.9020833333333332 | 0 |
| 0.9027777777777778 | 0 |
| 0.9034722222222222 | 0 |
| 0.9041666666666667 | 0 |
| 0.904861111111111 | 0 |
| 0.9055555555555556 | 0 |
| 0.90625 | 0 |
| 0.9069444444444444 | 0 |
| 0.907638888888889 | 0 |
| 0.9083333333333333 | 0 |
| 0.9090277777777778 | 0 |
| 0.9097222222222222 | 0 |
| 0.9104166666666668 | 0 |
| 0.9111111111111111 | 0 |
| 0.9118055555555555 | 0 |
| 0.9125 | 0 |
| 0.9131944444444445 | 0 |
| 0.9138888888888889 | 0 |
| 0.9145833333333333 | 0 |
| 0.9152777777777777 | 0 |
| 0.9159722222222223 | 0 |
| 0.9166666666666666 | 0 |
| 0.9173611111111111 | 0 |
| 0.9180555555555556 | 0 |
| 0.9187500000000001 | 0 |
| 0.9194444444444444 | 0 |
| 0.9201388888888888 | 0 |
| 0.9208333333333334 | 0 |
| 0.9215277777777778 | 0 |
| 0.9222222222222222 | 0 |
| 0.9229166666666666 | 0 |
| 0.9236111111111112 | 0 |
| 0.9243055555555556 | 0 |
| 0.9249999999999999 | 0 |
| 0.9256944444444444 | 0 |
| 0.9263888888888889 | 0 |
| 0.9270833333333334 | 0 |
| 0.9277777777777777 | 0 |
| 0.9284722222222223 | 0 |
| 0.9291666666666667 | 0 |
| 0.9298611111111111 | 0 |
| 0.9305555555555555 | 0 |
| 0.93125 | 0 |
| 0.9319444444444445 | 0 |
| 0.9326388888888889 | 0 |
| 0.9333333333333332 | 0 |
| 0.9340277777777778 | 0 |
| 0.9347222222222222 | 0 |
| 0.9354166666666667 | 0 |
| 0.936111111111111 | 0 |
| 0.9368055555555556 | 0 |
| 0.9375 | 0 |
| 0.9381944444444444 | 0 |
| 0.938888888888889 | 0 |
| 0.9395833333333333 | 0 |
| 0.9402777777777778 | 0 |
| 0.9409722222222222 | 0 |
| 0.9416666666666668 | 0 |
| 0.9423611111111111 | 0 |
| 0.9430555555555555 | 0 |
| 0.94375 | 0 |
| 0.9444444444444445 | 0 |
| 0.9451388888888889 | 0 |
| 0.9458333333333333 | 0 |
| 0.9465277777777777 | 0 |
| 0.9472222222222223 | 0 |
| 0.9479166666666666 | 0 |
| 0.9486111111111111 | 0 |
| 0.9493055555555556 | 0 |
| 0.9500000000000001 | 0 |
| 0.9506944444444444 | 0 |
| 0.9513888888888888 | 0 |
| 0.9520833333333334 | 0 |
| 0.9527777777777778 | 0 |
| 0.9534722222222222 | 0 |
| 0.9541666666666666 | 0 |
| 0.9548611111111112 | 0 |
| 0.9555555555555556 | 0 |
| 0.9562499999999999 | 0 |
| 0.9569444444444444 | 0 |
| 0.9576388888888889 | 0 |
| 0.9583333333333334 | 0 |
| 0.9590277777777777 | 0 |
| 0.9597222222222223 | 0 |
| 0.9604166666666667 | 0 |
| 0.9611111111111111 | 0 |
| 0.9618055555555555 | 0 |
| 0.9625 | 0 |
| 0.9631944444444445 | 0 |
| 0.9638888888888889 | 0 |
| 0.9645833333333332 | 0 |
| 0.9652777777777778 | 0 |
| 0.9659722222222222 | 0 |
| 0.9666666666666667 | 0 |
| 0.967361111111111 | 0 |
| 0.9680555555555556 | 0 |
| 0.96875 | 0 |
| 0.9694444444444444 | 0 |
| 0.970138888888889 | 0 |
| 0.9708333333333333 | 0 |
| 0.9715277777777778 | 0 |
| 0.9722222222222222 | 0 |
| 0.9729166666666668 | 0 |
| 0.9736111111111111 | 0 |
| 0.9743055555555555 | 0 |
| 0.975 | 0 |
| 0.9756944444444445 | 0 |
| 0.9763888888888889 | 0 |
| 0.9770833333333333 | 0 |
| 0.9777777777777777 | 0 |
| 0.9784722222222223 | 0 |
| 0.9791666666666666 | 0 |
| 0.9798611111111111 | 0 |
| 0.9805555555555556 | 0 |
| 0.9812500000000001 | 0 |
| 0.9819444444444444 | 0 |
| 0.9826388888888888 | 0 |
| 0.9833333333333334 | 0 |
| 0.9840277777777778 | 0 |
| 0.9847222222222222 | 0 |
| 0.9854166666666666 | 0 |
| 0.9861111111111112 | 0 |
| 0.9868055555555556 | 0 |
| 0.9874999999999999 | 0 |
| 0.9881944444444444 | 0 |
| 0.9888888888888889 | 0 |
| 0.9895833333333334 | 0 |
| 0.9902777777777777 | 0 |
| 0.9909722222222223 | 0 |
| 0.9916666666666667 | 0 |
| 0.9923611111111111 | 0 |
| 0.9930555555555555 | 0 |
| 0.99375 | 0 |
| 0.9944444444444445 | 0 |
| 0.9951388888888889 | 0 |
| 0.9958333333333332 | 0 |
| 0.9965277777777778 | 0 |
| 0.9972222222222222 | 0 |
| 0.9979166666666667 | 0 |
| 0.998611111111111 | 0 |
| 0.9993055555555556 | 0 |